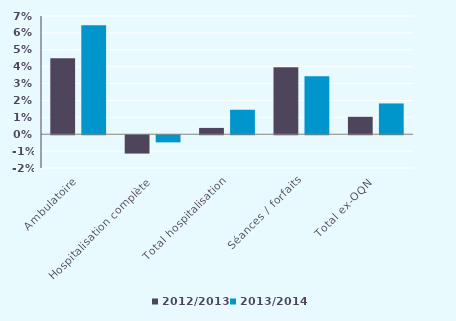
| Category | 2012/2013 | 2013/2014 |
|---|---|---|
| Ambulatoire  | 0.045 | 0.065 |
| Hospitalisation complète  | -0.011 | -0.004 |
| Total hospitalisation | 0.004 | 0.014 |
| Séances / forfaits | 0.04 | 0.034 |
| Total ex-OQN  | 0.01 | 0.018 |